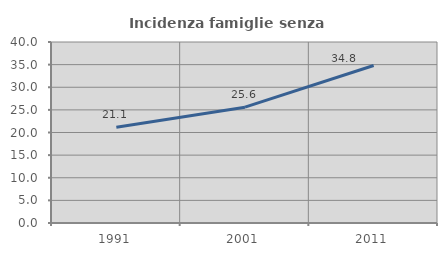
| Category | Incidenza famiglie senza nuclei |
|---|---|
| 1991.0 | 21.147 |
| 2001.0 | 25.593 |
| 2011.0 | 34.796 |